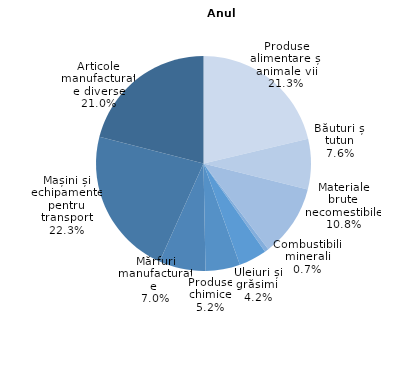
| Category | % |
|---|---|
| Produse alimentare și animale vii | 21.3 |
| Băuturi și tutun | 7.6 |
| Materiale brute necomestibile | 10.8 |
| Combustibili minerali | 0.6 |
| Uleiuri și grăsimi  | 4.2 |
| Produse chimice | 5.2 |
| Mărfuri manufacturate  | 7 |
| Mașini și echipamente pentru transport | 22.3 |
| Articole manufacturate diverse | 21 |